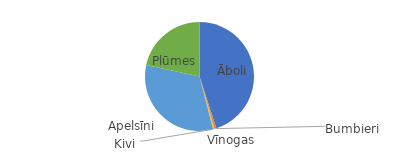
| Category | Apjoms |
|---|---|
| Āboli | 2500 |
| Bumbieri | 30 |
| Vīnogas | 10 |
| Kivi | 15 |
| Apelsīni | 1800 |
| Plūmes | 1200 |